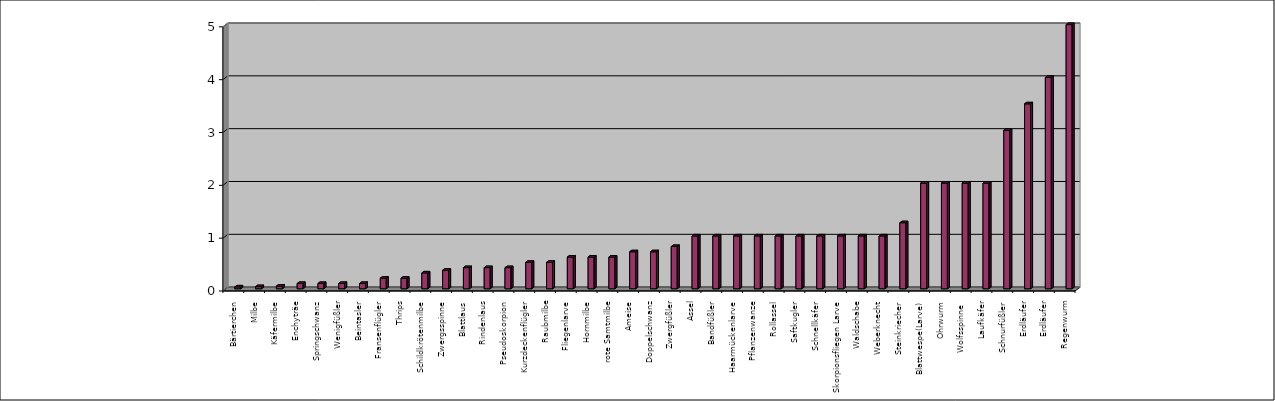
| Category | Series 0 | Series 1 |
|---|---|---|
| Bärtierchen |  | 0.035 |
| Milbe |  | 0.04 |
| Käfermilbe |  | 0.05 |
| Enchyträe |  | 0.1 |
| Springschwanz |  | 0.1 |
| Wenigfüßler |  | 0.1 |
| Beintasler |  | 0.1 |
| Fransenflügler |  | 0.2 |
| Thrips |  | 0.2 |
| Schildkrötenmilbe |  | 0.3 |
| Zwergsspinne |  | 0.35 |
| Blattlaus |  | 0.4 |
| Rindenlaus |  | 0.4 |
| Pseudoskorpion |  | 0.4 |
| Kurzdeckenflügler |  | 0.5 |
| Raubmilbe |  | 0.5 |
| Fliegenlarve |  | 0.6 |
| Hornmilbe |  | 0.6 |
| rote Samtmilbe |  | 0.6 |
| Ameise |  | 0.7 |
| Doppelschwanz |  | 0.7 |
| Zwergfüßler |  | 0.8 |
| Assel |  | 1 |
| Bandfüßler |  | 1 |
| Haarmückenlarve |  | 1 |
| Pflanzenwanze |  | 1 |
| Rollassel |  | 1 |
| Saftkugler |  | 1 |
| Schnellkäfer |  | 1 |
| Skorpionsfliegen Larve |  | 1 |
| Waldschabe |  | 1 |
| Weberknecht |  | 1 |
| Steinkriecher |  | 1.25 |
| Blattwespe(Larve) |  | 2 |
| Ohrwurm |  | 2 |
| Wolfsspinne  |  | 2 |
| Laufkäfer |  | 2 |
| Schnurfüßler |  | 3 |
| Erdläufer |  | 3.5 |
| Erdläufer |  | 4 |
| Regenwurm |  | 5 |